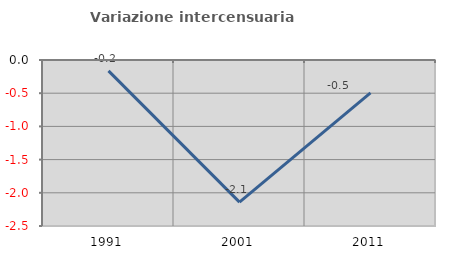
| Category | Variazione intercensuaria annua |
|---|---|
| 1991.0 | -0.163 |
| 2001.0 | -2.14 |
| 2011.0 | -0.495 |